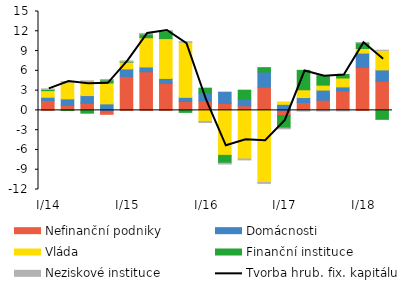
| Category | Nefinanční podniky | Domácnosti | Vláda | Finanční instituce | Neziskové instituce |
|---|---|---|---|---|---|
|  I/14 | 1.474 | 0.519 | 1.003 | 0.167 | 0.094 |
| II | 0.773 | 0.974 | 2.563 | -0.019 | 0.075 |
| III | 1.067 | 1.179 | 2.15 | -0.423 | 0.085 |
|  IV | -0.592 | 0.988 | 3.169 | 0.468 | 0.068 |
|  I/15 | 5.151 | 1.14 | 1.03 | 0.066 | 0.118 |
| II | 5.861 | 0.727 | 4.433 | 0.558 | 0.099 |
| III | 4.099 | 0.748 | 6.039 | 1.126 | 0.101 |
| IV | 1.35 | 0.631 | 8.349 | -0.301 | 0.098 |
|  I/16 | 1.462 | 1.228 | -1.675 | 0.684 | -0.158 |
| II | 1.064 | 1.7 | -6.82 | -1.194 | -0.123 |
| III | 0.703 | 1.012 | -7.369 | 1.351 | -0.141 |
| IV | 3.53 | 2.292 | -10.936 | 0.661 | -0.135 |
|  I/17 | -0.785 | 0.918 | 0.36 | -1.899 | -0.113 |
| II | 1.196 | 0.75 | 1.18 | 2.944 | -0.099 |
| III | 1.54 | 1.54 | 0.749 | 1.431 | -0.09 |
| IV | 2.947 | 0.614 | 1.354 | 0.538 | -0.077 |
|  I/18 | 6.527 | 2.167 | 0.695 | 0.857 | 0.017 |
| II | 4.405 | 1.734 | 2.963 | -1.356 | 0.015 |